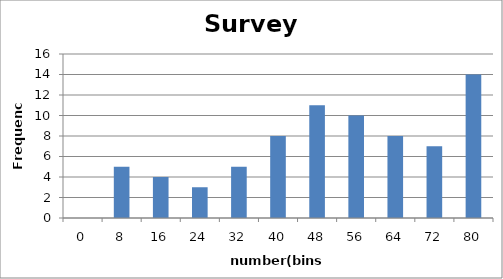
| Category | Series 0 |
|---|---|
| 0.0 | 0 |
| 8.0 | 5 |
| 16.0 | 4 |
| 24.0 | 3 |
| 32.0 | 5 |
| 40.0 | 8 |
| 48.0 | 11 |
| 56.0 | 10 |
| 64.0 | 8 |
| 72.0 | 7 |
| 80.0 | 14 |